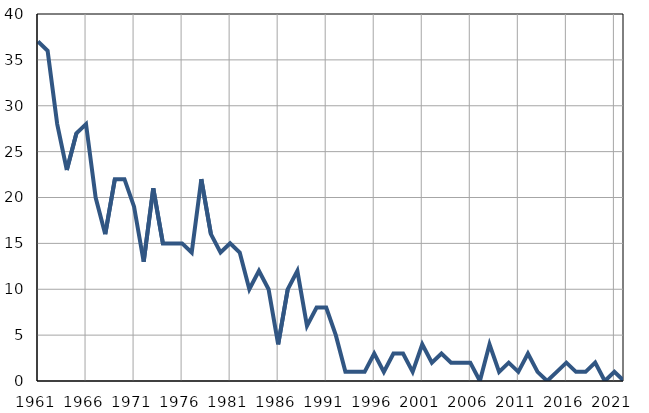
| Category | Infants
deaths |
|---|---|
| 1961.0 | 37 |
| 1962.0 | 36 |
| 1963.0 | 28 |
| 1964.0 | 23 |
| 1965.0 | 27 |
| 1966.0 | 28 |
| 1967.0 | 20 |
| 1968.0 | 16 |
| 1969.0 | 22 |
| 1970.0 | 22 |
| 1971.0 | 19 |
| 1972.0 | 13 |
| 1973.0 | 21 |
| 1974.0 | 15 |
| 1975.0 | 15 |
| 1976.0 | 15 |
| 1977.0 | 14 |
| 1978.0 | 22 |
| 1979.0 | 16 |
| 1980.0 | 14 |
| 1981.0 | 15 |
| 1982.0 | 14 |
| 1983.0 | 10 |
| 1984.0 | 12 |
| 1985.0 | 10 |
| 1986.0 | 4 |
| 1987.0 | 10 |
| 1988.0 | 12 |
| 1989.0 | 6 |
| 1990.0 | 8 |
| 1991.0 | 8 |
| 1992.0 | 5 |
| 1993.0 | 1 |
| 1994.0 | 1 |
| 1995.0 | 1 |
| 1996.0 | 3 |
| 1997.0 | 1 |
| 1998.0 | 3 |
| 1999.0 | 3 |
| 2000.0 | 1 |
| 2001.0 | 4 |
| 2002.0 | 2 |
| 2003.0 | 3 |
| 2004.0 | 2 |
| 2005.0 | 2 |
| 2006.0 | 2 |
| 2007.0 | 0 |
| 2008.0 | 4 |
| 2009.0 | 1 |
| 2010.0 | 2 |
| 2011.0 | 1 |
| 2012.0 | 3 |
| 2013.0 | 1 |
| 2014.0 | 0 |
| 2015.0 | 1 |
| 2016.0 | 2 |
| 2017.0 | 1 |
| 2018.0 | 1 |
| 2019.0 | 2 |
| 2020.0 | 0 |
| 2021.0 | 1 |
| 2022.0 | 0 |